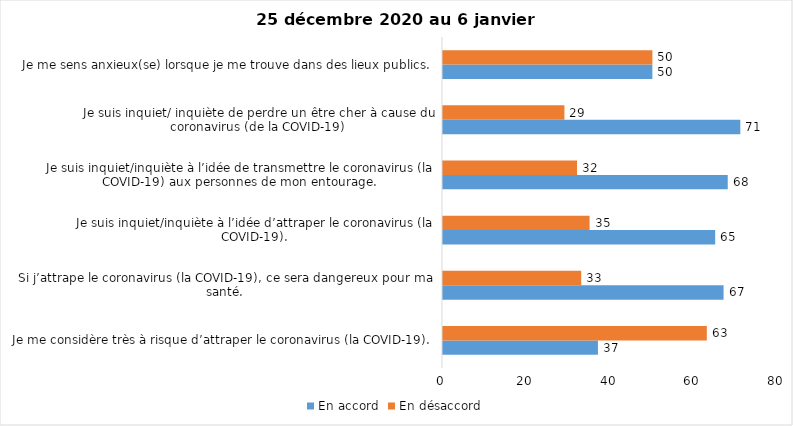
| Category | En accord | En désaccord |
|---|---|---|
| Je me considère très à risque d’attraper le coronavirus (la COVID-19). | 37 | 63 |
| Si j’attrape le coronavirus (la COVID-19), ce sera dangereux pour ma santé. | 67 | 33 |
| Je suis inquiet/inquiète à l’idée d’attraper le coronavirus (la COVID-19). | 65 | 35 |
| Je suis inquiet/inquiète à l’idée de transmettre le coronavirus (la COVID-19) aux personnes de mon entourage. | 68 | 32 |
| Je suis inquiet/ inquiète de perdre un être cher à cause du coronavirus (de la COVID-19) | 71 | 29 |
| Je me sens anxieux(se) lorsque je me trouve dans des lieux publics. | 50 | 50 |